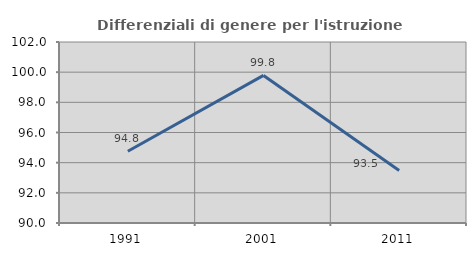
| Category | Differenziali di genere per l'istruzione superiore |
|---|---|
| 1991.0 | 94.759 |
| 2001.0 | 99.785 |
| 2011.0 | 93.48 |